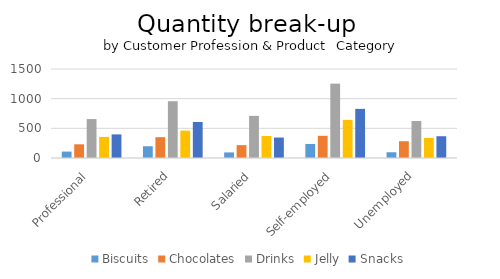
| Category | Biscuits | Chocolates | Drinks | Jelly | Snacks |
|---|---|---|---|---|---|
| Professional | 108 | 231 | 656 | 356 | 398 |
| Retired | 198 | 351 | 957 | 462 | 607 |
| Salaried | 94 | 217 | 710 | 371 | 345 |
| Self-employed | 237 | 374 | 1253 | 643 | 828 |
| Unemployed | 97 | 283 | 624 | 338 | 367 |